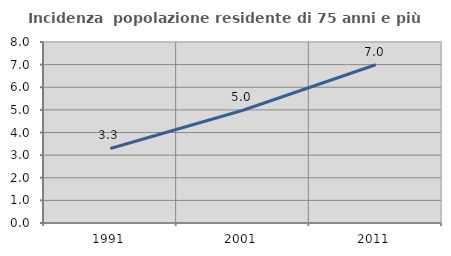
| Category | Incidenza  popolazione residente di 75 anni e più |
|---|---|
| 1991.0 | 3.295 |
| 2001.0 | 4.983 |
| 2011.0 | 6.996 |